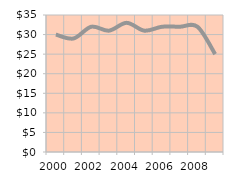
| Category | Total number 
of Establishments |
|---|---|
| 2000.0 | 30 |
| 2001.0 | 29 |
| 2002.0 | 32 |
| 2003.0 | 31 |
| 2004.0 | 33 |
| 2005.0 | 31 |
| 2006.0 | 32 |
| 2007.0 | 32 |
| 2008.0 | 32 |
| 2009.0 | 25 |